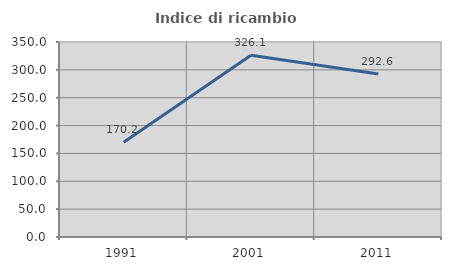
| Category | Indice di ricambio occupazionale  |
|---|---|
| 1991.0 | 170.175 |
| 2001.0 | 326.087 |
| 2011.0 | 292.593 |